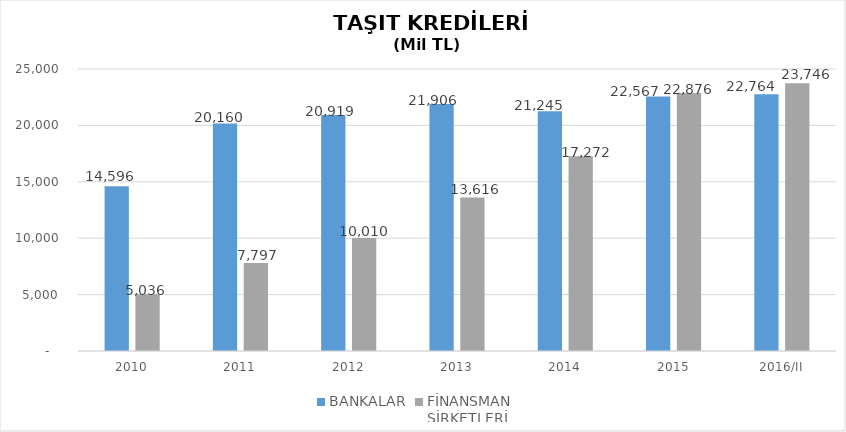
| Category | BANKALAR | FİNANSMAN 
ŞİRKETLERİ |
|---|---|---|
| 2010 | 14596 | 5035.89 |
| 2011 | 20160 | 7796.854 |
| 2012 | 20919 | 10009.755 |
| 2013 | 21906 | 13616.036 |
| 2014 | 21245 | 17271.844 |
| 2015 | 22567 | 22875.563 |
| 2016/II | 22764 | 23745.855 |